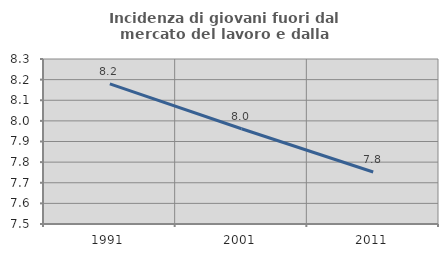
| Category | Incidenza di giovani fuori dal mercato del lavoro e dalla formazione  |
|---|---|
| 1991.0 | 8.179 |
| 2001.0 | 7.962 |
| 2011.0 | 7.752 |